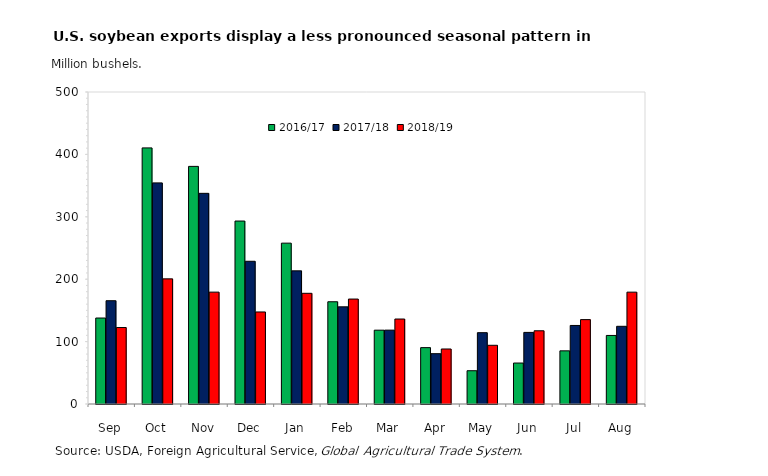
| Category | 2016/17 | 2017/18 | 2018/19 |
|---|---|---|---|
| Sep | 137.778 | 165.529 | 122.556 |
| Oct | 410.415 | 354.356 | 200.534 |
| Nov | 380.804 | 337.603 | 179.285 |
| Dec | 293.219 | 228.726 | 147.507 |
| Jan | 257.787 | 213.381 | 177.408 |
| Feb | 163.859 | 155.706 | 168.189 |
| Mar | 118.299 | 118.371 | 136.192 |
| Apr | 90.342 | 80.632 | 88.157 |
| May | 53.313 | 114.291 | 94.08 |
| Jun | 65.634 | 114.754 | 117.343 |
| Jul | 85.191 | 125.858 | 135.233 |
| Aug | 109.872 | 124.523 | 179.245 |